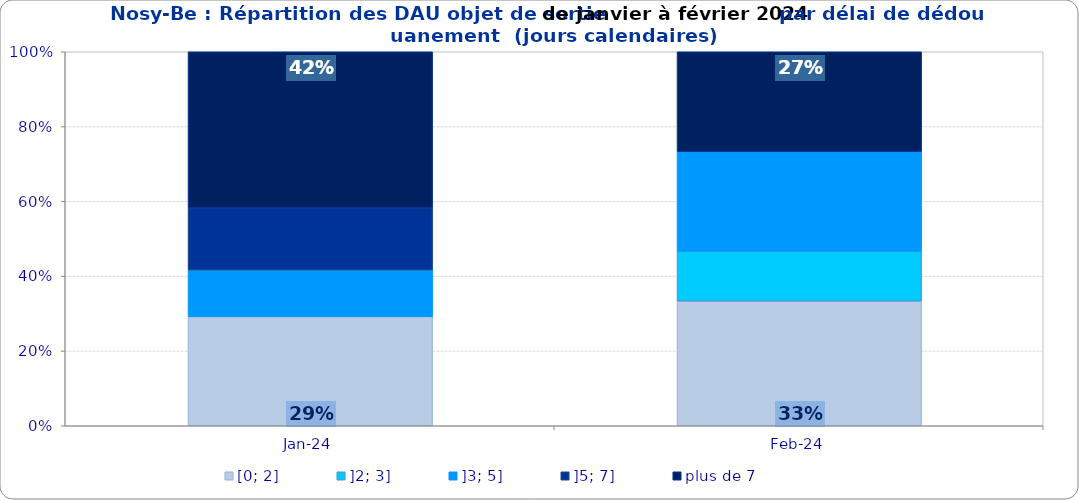
| Category | [0; 2] | ]2; 3] | ]3; 5] | ]5; 7] | plus de 7 |
|---|---|---|---|---|---|
| 2024-01-01 | 0.292 | 0 | 0.125 | 0.167 | 0.417 |
| 2024-02-01 | 0.333 | 0.133 | 0.267 | 0 | 0.267 |